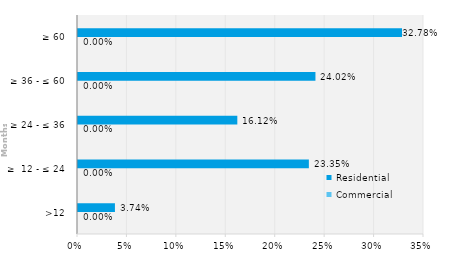
| Category | Commercial | Residential |
|---|---|---|
| >12 | 0 | 0.037 |
| ≥  12 - ≤ 24 | 0 | 0.234 |
| ≥ 24 - ≤ 36 | 0 | 0.161 |
| ≥ 36 - ≤ 60 | 0 | 0.24 |
| ≥ 60 | 0 | 0.328 |